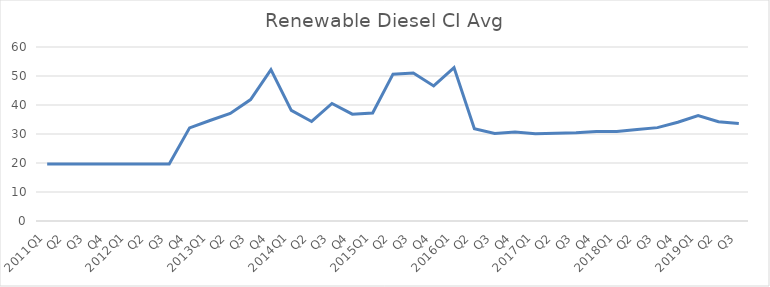
| Category | Series 0 |
|---|---|
| 2011Q1 | 19.65 |
| Q2 | 19.65 |
| Q3 | 19.65 |
| Q4 | 19.65 |
| 2012Q1 | 19.65 |
| Q2 | 19.65 |
| Q3 | 19.65 |
| Q4 | 32.11 |
| 2013Q1 | 34.65 |
| Q2 | 37.1 |
| Q3 | 41.86 |
| Q4 | 52.18 |
| 2014Q1 | 38.16 |
| Q2 | 34.32 |
| Q3 | 40.53 |
| Q4 | 36.84 |
| 2015Q1 | 37.26 |
| Q2 | 50.63 |
| Q3 | 51.06 |
| Q4 | 46.56 |
| 2016Q1 | 52.89 |
| Q2 | 31.78 |
| Q3 | 30.2 |
| Q4 | 30.71 |
| 2017Q1 | 30.11 |
| Q2 | 30.23 |
| Q3 | 30.39 |
| Q4 | 30.9 |
| 2018Q1 | 30.9 |
| Q2 | 31.53 |
| Q3 | 32.2 |
| Q4 | 34.05 |
| 2019Q1 | 36.39 |
| Q2 | 34.25 |
| Q3 | 33.58 |